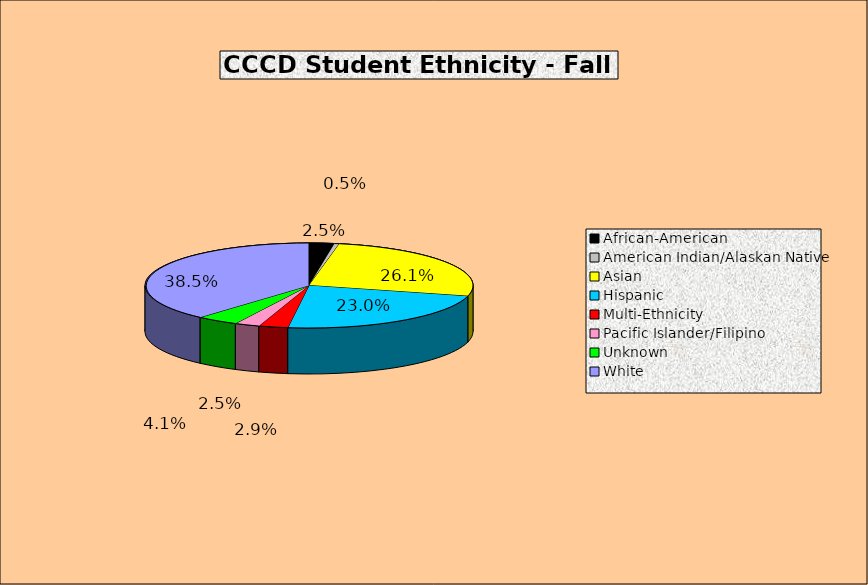
| Category | Series 0 |
|---|---|
| African-American | 0.025 |
| American Indian/Alaskan Native | 0.005 |
| Asian | 0.261 |
| Hispanic | 0.23 |
| Multi-Ethnicity | 0.029 |
| Pacific Islander/Filipino | 0.025 |
| Unknown | 0.041 |
| White | 0.385 |